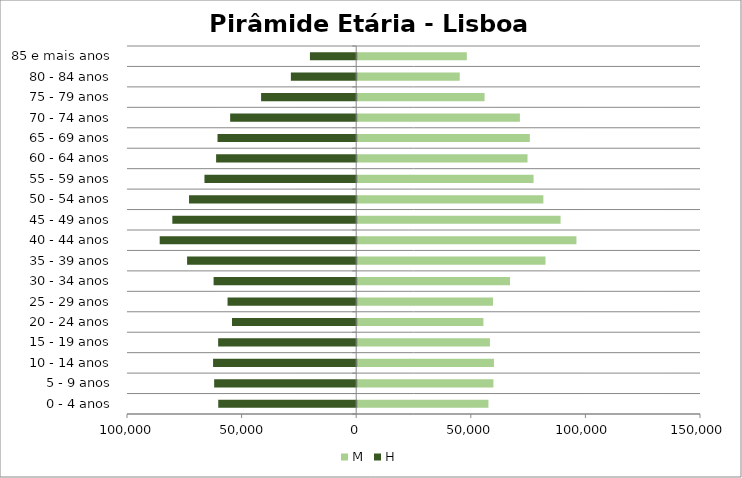
| Category | M | H |
|---|---|---|
| 0 - 4 anos | 57255 | -60191 |
| 5 - 9 anos | 59424 | -61968 |
| 10 - 14 anos | 59667 | -62444 |
| 15 - 19 anos | 57909 | -60227 |
| 20 - 24 anos | 55059 | -54192 |
| 25 - 29 anos | 59256 | -56132 |
| 30 - 34 anos | 66670 | -62213 |
| 35 - 39 anos | 82152 | -73784 |
| 40 - 44 anos | 95649 | -85734 |
| 45 - 49 anos | 88738 | -80228 |
| 50 - 54 anos | 81218 | -72931 |
| 55 - 59 anos | 76953 | -66203 |
| 60 - 64 anos | 74312 | -61120 |
| 65 - 69 anos | 75325 | -60508 |
| 70 - 74 anos | 70991 | -54994 |
| 75 - 79 anos | 55575 | -41495 |
| 80 - 84 anos | 44739 | -28502 |
| 85 e mais anos | 47828 | -20186 |